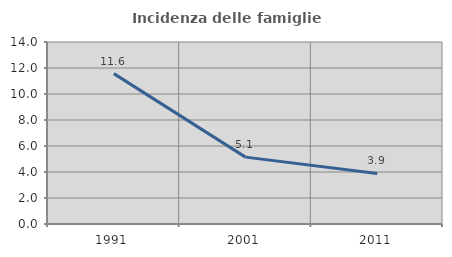
| Category | Incidenza delle famiglie numerose |
|---|---|
| 1991.0 | 11.567 |
| 2001.0 | 5.144 |
| 2011.0 | 3.886 |